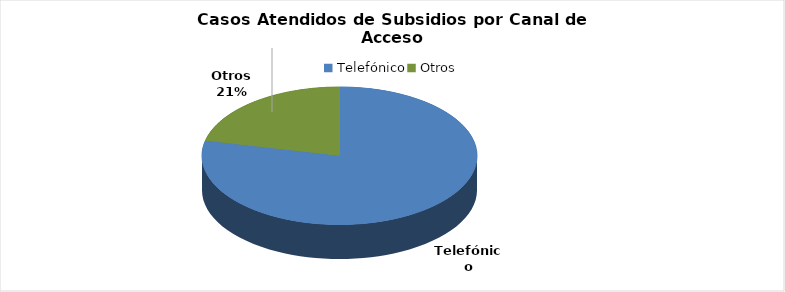
| Category | Total |
|---|---|
| Telefónico | 86539 |
| Otros | 23666 |